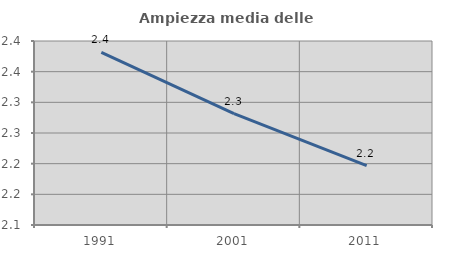
| Category | Ampiezza media delle famiglie |
|---|---|
| 1991.0 | 2.381 |
| 2001.0 | 2.281 |
| 2011.0 | 2.197 |